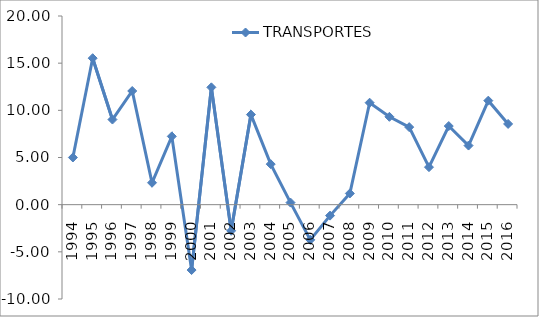
| Category | TRANSPORTES |
|---|---|
| 1994.0 | 5 |
| 1995.0 | 15.526 |
| 1996.0 | 9.023 |
| 1997.0 | 12.05 |
| 1998.0 | 2.323 |
| 1999.0 | 7.239 |
| 2000.0 | -6.93 |
| 2001.0 | 12.437 |
| 2002.0 | -2.77 |
| 2003.0 | 9.549 |
| 2004.0 | 4.296 |
| 2005.0 | 0.221 |
| 2006.0 | -3.728 |
| 2007.0 | -1.161 |
| 2008.0 | 1.189 |
| 2009.0 | 10.809 |
| 2010.0 | 9.312 |
| 2011.0 | 8.221 |
| 2012.0 | 3.975 |
| 2013.0 | 8.335 |
| 2014.0 | 6.267 |
| 2015.0 | 11.026 |
| 2016.0 | 8.558 |